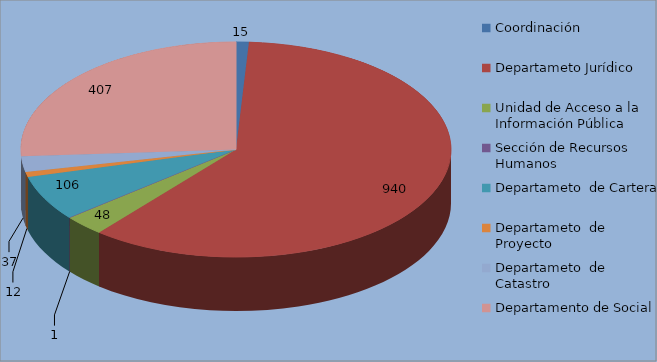
| Category | Series 0 |
|---|---|
| Coordinación | 15 |
| Departameto Jurídico  | 940 |
| Unidad de Acceso a la Información Pública | 48 |
| Sección de Recursos Humanos | 1 |
| Departameto  de Cartera | 106 |
| Departameto  de Proyecto | 12 |
| Departameto  de Catastro | 37 |
| Departamento de Social | 407 |